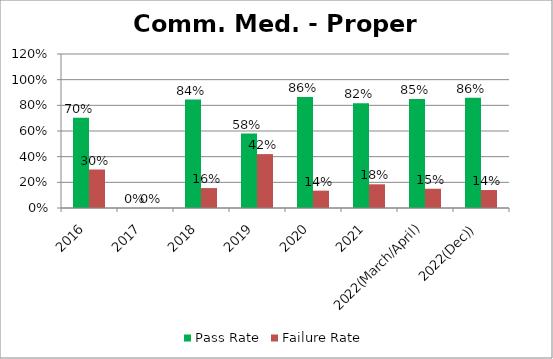
| Category | Pass Rate | Failure Rate |
|---|---|---|
| 2016 | 0.704 | 0.3 |
| 2017 | 0 | 0 |
| 2018 | 0.845 | 0.155 |
| 2019 | 0.58 | 0.42 |
| 2020 | 0.865 | 0.135 |
| 2021 | 0.815 | 0.185 |
| 2022(March/April) | 0.85 | 0.15 |
| 2022(Dec)) | 0.86 | 0.14 |